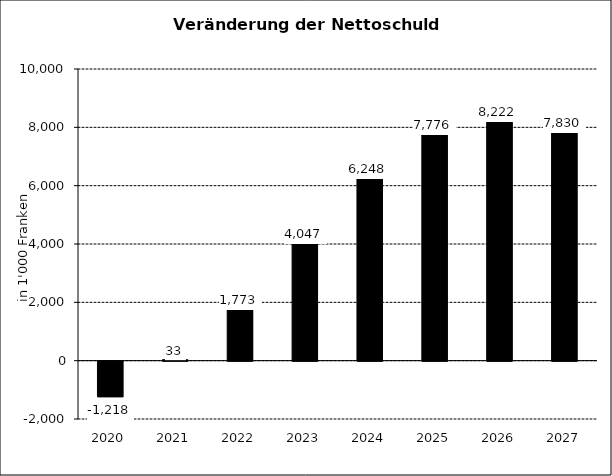
| Category | Veränderung der Nettoschuld kumuliert |
|---|---|
| 2020.0 | -1218 |
| 2021.0 | 33 |
| 2022.0 | 1773 |
| 2023.0 | 4046.638 |
| 2024.0 | 6248.01 |
| 2025.0 | 7776.126 |
| 2026.0 | 8221.946 |
| 2027.0 | 7829.676 |